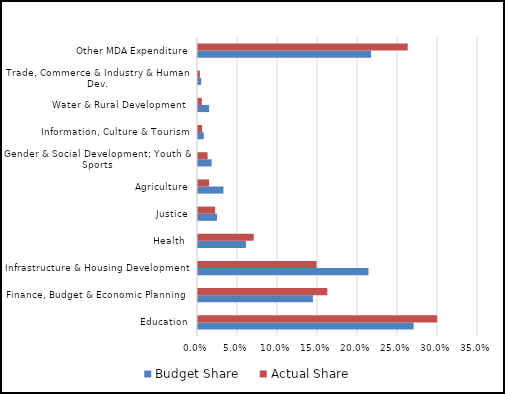
| Category | Budget Share | Actual Share |
|---|---|---|
| Education | 0.27 | 0.299 |
| Finance, Budget & Economic Planning  | 0.144 | 0.162 |
| Infrastructure & Housing Development | 0.213 | 0.148 |
| Health  | 0.06 | 0.07 |
| Justice | 0.024 | 0.021 |
| Agriculture | 0.032 | 0.014 |
| Gender & Social Development; Youth & Sports | 0.017 | 0.012 |
| Information, Culture & Tourism | 0.007 | 0.005 |
| Water & Rural Development  | 0.014 | 0.005 |
| Trade, Commerce & Industry & Human Dev. | 0.004 | 0.002 |
| Other MDA Expenditure | 0.216 | 0.262 |